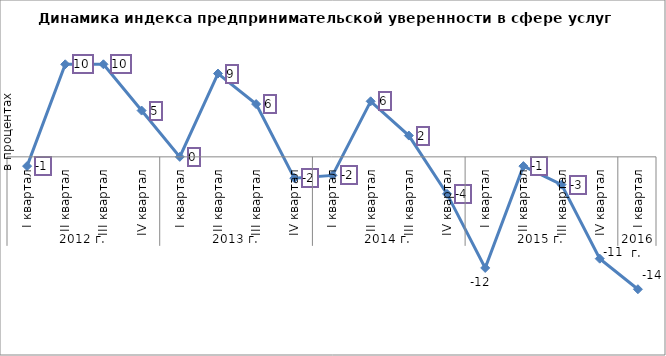
| Category | Российская Федерация |
|---|---|
| 0 | -1 |
| 1 | 10 |
| 2 | 10 |
| 3 | 5 |
| 4 | 0 |
| 5 | 9 |
| 6 | 5.7 |
| 7 | -2.3 |
| 8 | -2 |
| 9 | 6 |
| 10 | 2.3 |
| 11 | -4 |
| 12 | -12 |
| 13 | -1 |
| 14 | -3 |
| 15 | -11 |
| 16 | -14.3 |